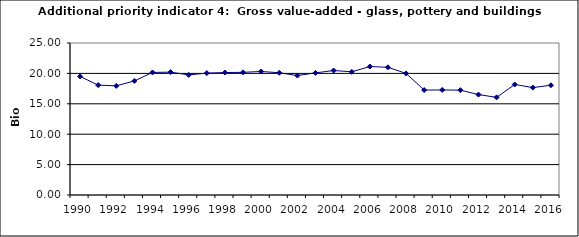
| Category | Gross value-added - glass, pottery and buildings materials industry, Bio Euro (EC95) |
|---|---|
| 1990 | 19.503 |
| 1991 | 18.072 |
| 1992 | 17.948 |
| 1993 | 18.761 |
| 1994 | 20.157 |
| 1995 | 20.21 |
| 1996 | 19.75 |
| 1997 | 20.051 |
| 1998 | 20.139 |
| 1999 | 20.174 |
| 2000 | 20.316 |
| 2001 | 20.104 |
| 2002 | 19.644 |
| 2003 | 20.086 |
| 2004 | 20.475 |
| 2005 | 20.263 |
| 2006 | 21.128 |
| 2007 | 21.005 |
| 2008 | 19.998 |
| 2009 | 17.259 |
| 2010 | 17.277 |
| 2011 | 17.242 |
| 2012 | 16.518 |
| 2013 | 16.058 |
| 2014 | 18.178 |
| 2015 | 17.666 |
| 2016 | 18.054 |